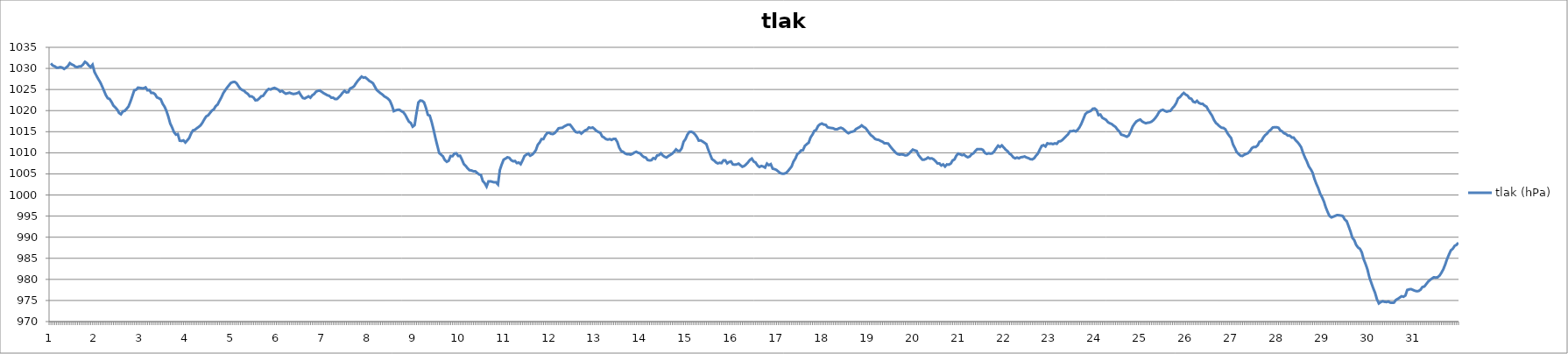
| Category | tlak (hPa) |
|---|---|
| 0 | 1031.19 |
| 1 | 1030.69 |
| 2 | 1030.5 |
| 3 | 1030.19 |
| 4 | 1030.19 |
| 5 | 1030.31 |
| 6 | 1030.19 |
| 7 | 1029.88 |
| 8 | 1030.19 |
| 9 | 1030.56 |
| 10 | 1031.25 |
| 11 | 1030.94 |
| 12 | 1030.75 |
| 13 | 1030.38 |
| 14 | 1030.31 |
| 15 | 1030.5 |
| 16 | 1030.5 |
| 17 | 1030.94 |
| 18 | 1031.56 |
| 19 | 1031.25 |
| 20 | 1030.69 |
| 21 | 1030.31 |
| 22 | 1030.88 |
| 23 | 1029.19 |
| 24 | 1028.31 |
| 25 | 1027.5 |
| 26 | 1026.75 |
| 27 | 1025.81 |
| 28 | 1024.75 |
| 29 | 1023.69 |
| 30 | 1022.94 |
| 31 | 1022.75 |
| 32 | 1022.06 |
| 33 | 1021.19 |
| 34 | 1020.75 |
| 35 | 1020.25 |
| 36 | 1019.44 |
| 37 | 1019.13 |
| 38 | 1019.81 |
| 39 | 1019.94 |
| 40 | 1020.44 |
| 41 | 1021 |
| 42 | 1022.13 |
| 43 | 1023.44 |
| 44 | 1024.81 |
| 45 | 1024.94 |
| 46 | 1025.44 |
| 47 | 1025.38 |
| 48 | 1025.31 |
| 49 | 1025.31 |
| 50 | 1025.5 |
| 51 | 1024.81 |
| 52 | 1024.88 |
| 53 | 1024.19 |
| 54 | 1024.19 |
| 55 | 1023.88 |
| 56 | 1023.13 |
| 57 | 1022.94 |
| 58 | 1022.69 |
| 59 | 1021.63 |
| 60 | 1020.94 |
| 61 | 1019.94 |
| 62 | 1018.56 |
| 63 | 1016.94 |
| 64 | 1016 |
| 65 | 1014.88 |
| 66 | 1014.31 |
| 67 | 1014.44 |
| 68 | 1012.88 |
| 69 | 1012.81 |
| 70 | 1012.94 |
| 71 | 1012.44 |
| 72 | 1012.94 |
| 73 | 1013.5 |
| 74 | 1014.56 |
| 75 | 1015.31 |
| 76 | 1015.44 |
| 77 | 1015.81 |
| 78 | 1016.13 |
| 79 | 1016.5 |
| 80 | 1017.13 |
| 81 | 1017.94 |
| 82 | 1018.63 |
| 83 | 1018.88 |
| 84 | 1019.44 |
| 85 | 1020 |
| 86 | 1020.31 |
| 87 | 1021.06 |
| 88 | 1021.44 |
| 89 | 1022.31 |
| 90 | 1023.13 |
| 91 | 1024.13 |
| 92 | 1024.81 |
| 93 | 1025.44 |
| 94 | 1026 |
| 95 | 1026.56 |
| 96 | 1026.75 |
| 97 | 1026.81 |
| 98 | 1026.5 |
| 99 | 1025.81 |
| 100 | 1025.19 |
| 101 | 1024.88 |
| 102 | 1024.69 |
| 103 | 1024.25 |
| 104 | 1023.94 |
| 105 | 1023.38 |
| 106 | 1023.38 |
| 107 | 1023.06 |
| 108 | 1022.44 |
| 109 | 1022.5 |
| 110 | 1022.88 |
| 111 | 1023.38 |
| 112 | 1023.5 |
| 113 | 1024.13 |
| 114 | 1024.75 |
| 115 | 1025.13 |
| 116 | 1025 |
| 117 | 1025.25 |
| 118 | 1025.38 |
| 119 | 1025.19 |
| 120 | 1024.94 |
| 121 | 1024.5 |
| 122 | 1024.69 |
| 123 | 1024.31 |
| 124 | 1024 |
| 125 | 1024.13 |
| 126 | 1024.25 |
| 127 | 1024.06 |
| 128 | 1023.94 |
| 129 | 1024 |
| 130 | 1024.13 |
| 131 | 1024.38 |
| 132 | 1023.63 |
| 133 | 1023 |
| 134 | 1022.88 |
| 135 | 1023.13 |
| 136 | 1023.38 |
| 137 | 1023.06 |
| 138 | 1023.63 |
| 139 | 1023.94 |
| 140 | 1024.5 |
| 141 | 1024.69 |
| 142 | 1024.75 |
| 143 | 1024.44 |
| 144 | 1024.13 |
| 145 | 1023.88 |
| 146 | 1023.63 |
| 147 | 1023.5 |
| 148 | 1023.06 |
| 149 | 1023.06 |
| 150 | 1022.75 |
| 151 | 1022.75 |
| 152 | 1023.19 |
| 153 | 1023.63 |
| 154 | 1024.25 |
| 155 | 1024.69 |
| 156 | 1024.31 |
| 157 | 1024.38 |
| 158 | 1025.25 |
| 159 | 1025.44 |
| 160 | 1025.75 |
| 161 | 1026.44 |
| 162 | 1027.06 |
| 163 | 1027.56 |
| 164 | 1028.06 |
| 165 | 1027.81 |
| 166 | 1027.88 |
| 167 | 1027.5 |
| 168 | 1027.06 |
| 169 | 1026.81 |
| 170 | 1026.5 |
| 171 | 1025.69 |
| 172 | 1024.88 |
| 173 | 1024.5 |
| 174 | 1024.13 |
| 175 | 1023.81 |
| 176 | 1023.38 |
| 177 | 1023.13 |
| 178 | 1022.81 |
| 179 | 1022.31 |
| 180 | 1021.25 |
| 181 | 1019.88 |
| 182 | 1020.06 |
| 183 | 1020.19 |
| 184 | 1020.19 |
| 185 | 1019.88 |
| 186 | 1019.63 |
| 187 | 1019.06 |
| 188 | 1018.19 |
| 189 | 1017.38 |
| 190 | 1017.06 |
| 191 | 1016.19 |
| 192 | 1016.56 |
| 193 | 1019.44 |
| 194 | 1021.94 |
| 195 | 1022.38 |
| 196 | 1022.31 |
| 197 | 1021.94 |
| 198 | 1020.63 |
| 199 | 1019 |
| 200 | 1018.81 |
| 201 | 1017.31 |
| 202 | 1015.5 |
| 203 | 1013.5 |
| 204 | 1011.69 |
| 205 | 1009.94 |
| 206 | 1009.56 |
| 207 | 1009.13 |
| 208 | 1008.25 |
| 209 | 1007.88 |
| 210 | 1008.13 |
| 211 | 1009.25 |
| 212 | 1009.19 |
| 213 | 1009.81 |
| 214 | 1009.88 |
| 215 | 1009.25 |
| 216 | 1009.31 |
| 217 | 1008.38 |
| 218 | 1007.31 |
| 219 | 1006.88 |
| 220 | 1006.31 |
| 221 | 1005.88 |
| 222 | 1005.81 |
| 223 | 1005.63 |
| 224 | 1005.63 |
| 225 | 1005.25 |
| 226 | 1004.88 |
| 227 | 1004.75 |
| 228 | 1003.31 |
| 229 | 1002.81 |
| 230 | 1002 |
| 231 | 1003.25 |
| 232 | 1003.25 |
| 233 | 1003.13 |
| 234 | 1003 |
| 235 | 1003 |
| 236 | 1002.5 |
| 237 | 1005.94 |
| 238 | 1007.25 |
| 239 | 1008.38 |
| 240 | 1008.63 |
| 241 | 1008.94 |
| 242 | 1008.81 |
| 243 | 1008.25 |
| 244 | 1008 |
| 245 | 1008.06 |
| 246 | 1007.56 |
| 247 | 1007.69 |
| 248 | 1007.31 |
| 249 | 1008.19 |
| 250 | 1009.25 |
| 251 | 1009.56 |
| 252 | 1009.81 |
| 253 | 1009.31 |
| 254 | 1009.56 |
| 255 | 1010 |
| 256 | 1010.63 |
| 257 | 1011.88 |
| 258 | 1012.44 |
| 259 | 1013.25 |
| 260 | 1013.25 |
| 261 | 1014.13 |
| 262 | 1014.69 |
| 263 | 1014.75 |
| 264 | 1014.5 |
| 265 | 1014.44 |
| 266 | 1014.69 |
| 267 | 1015.19 |
| 268 | 1015.81 |
| 269 | 1015.88 |
| 270 | 1015.94 |
| 271 | 1016.25 |
| 272 | 1016.5 |
| 273 | 1016.69 |
| 274 | 1016.69 |
| 275 | 1016.13 |
| 276 | 1015.5 |
| 277 | 1014.94 |
| 278 | 1014.81 |
| 279 | 1014.94 |
| 280 | 1014.56 |
| 281 | 1014.94 |
| 282 | 1015.31 |
| 283 | 1015.5 |
| 284 | 1016 |
| 285 | 1015.88 |
| 286 | 1016 |
| 287 | 1015.63 |
| 288 | 1015.19 |
| 289 | 1014.94 |
| 290 | 1014.75 |
| 291 | 1013.88 |
| 292 | 1013.63 |
| 293 | 1013.25 |
| 294 | 1013.13 |
| 295 | 1013.25 |
| 296 | 1013.06 |
| 297 | 1013.31 |
| 298 | 1013.31 |
| 299 | 1012.56 |
| 300 | 1011.25 |
| 301 | 1010.44 |
| 302 | 1010.25 |
| 303 | 1009.88 |
| 304 | 1009.69 |
| 305 | 1009.69 |
| 306 | 1009.56 |
| 307 | 1009.75 |
| 308 | 1010.06 |
| 309 | 1010.25 |
| 310 | 1010 |
| 311 | 1009.88 |
| 312 | 1009.38 |
| 313 | 1009 |
| 314 | 1008.88 |
| 315 | 1008.31 |
| 316 | 1008.19 |
| 317 | 1008.25 |
| 318 | 1008.75 |
| 319 | 1008.56 |
| 320 | 1009.38 |
| 321 | 1009.44 |
| 322 | 1009.88 |
| 323 | 1009.38 |
| 324 | 1009.06 |
| 325 | 1008.88 |
| 326 | 1009.25 |
| 327 | 1009.5 |
| 328 | 1009.81 |
| 329 | 1010.25 |
| 330 | 1010.81 |
| 331 | 1010.44 |
| 332 | 1010.44 |
| 333 | 1011.06 |
| 334 | 1012.63 |
| 335 | 1013.25 |
| 336 | 1014.31 |
| 337 | 1014.94 |
| 338 | 1015 |
| 339 | 1014.81 |
| 340 | 1014.38 |
| 341 | 1013.75 |
| 342 | 1012.88 |
| 343 | 1012.94 |
| 344 | 1012.69 |
| 345 | 1012.38 |
| 346 | 1012.06 |
| 347 | 1010.75 |
| 348 | 1009.63 |
| 349 | 1008.5 |
| 350 | 1008.19 |
| 351 | 1007.75 |
| 352 | 1007.5 |
| 353 | 1007.63 |
| 354 | 1007.56 |
| 355 | 1008.19 |
| 356 | 1008.19 |
| 357 | 1007.5 |
| 358 | 1007.81 |
| 359 | 1007.94 |
| 360 | 1007.25 |
| 361 | 1007.19 |
| 362 | 1007.25 |
| 363 | 1007.44 |
| 364 | 1007.06 |
| 365 | 1006.69 |
| 366 | 1006.88 |
| 367 | 1007.25 |
| 368 | 1007.75 |
| 369 | 1008.31 |
| 370 | 1008.63 |
| 371 | 1007.94 |
| 372 | 1007.69 |
| 373 | 1007 |
| 374 | 1006.63 |
| 375 | 1006.88 |
| 376 | 1006.75 |
| 377 | 1006.5 |
| 378 | 1007.44 |
| 379 | 1007.06 |
| 380 | 1007.31 |
| 381 | 1006.25 |
| 382 | 1006.13 |
| 383 | 1005.94 |
| 384 | 1005.56 |
| 385 | 1005.19 |
| 386 | 1005.06 |
| 387 | 1005.06 |
| 388 | 1005.19 |
| 389 | 1005.63 |
| 390 | 1006.19 |
| 391 | 1006.75 |
| 392 | 1007.94 |
| 393 | 1008.63 |
| 394 | 1009.69 |
| 395 | 1010 |
| 396 | 1010.56 |
| 397 | 1010.63 |
| 398 | 1011.63 |
| 399 | 1012.06 |
| 400 | 1012.38 |
| 401 | 1013.63 |
| 402 | 1014.31 |
| 403 | 1015.19 |
| 404 | 1015.44 |
| 405 | 1016.38 |
| 406 | 1016.75 |
| 407 | 1016.94 |
| 408 | 1016.69 |
| 409 | 1016.63 |
| 410 | 1016.06 |
| 411 | 1015.94 |
| 412 | 1015.88 |
| 413 | 1015.81 |
| 414 | 1015.56 |
| 415 | 1015.56 |
| 416 | 1015.81 |
| 417 | 1015.94 |
| 418 | 1015.75 |
| 419 | 1015.38 |
| 420 | 1014.94 |
| 421 | 1014.63 |
| 422 | 1014.88 |
| 423 | 1015 |
| 424 | 1015.13 |
| 425 | 1015.63 |
| 426 | 1015.88 |
| 427 | 1016.13 |
| 428 | 1016.5 |
| 429 | 1016.13 |
| 430 | 1015.88 |
| 431 | 1015.31 |
| 432 | 1014.63 |
| 433 | 1014.13 |
| 434 | 1013.81 |
| 435 | 1013.31 |
| 436 | 1013.13 |
| 437 | 1013.06 |
| 438 | 1012.81 |
| 439 | 1012.63 |
| 440 | 1012.25 |
| 441 | 1012.25 |
| 442 | 1012.19 |
| 443 | 1011.56 |
| 444 | 1011 |
| 445 | 1010.5 |
| 446 | 1010 |
| 447 | 1009.69 |
| 448 | 1009.56 |
| 449 | 1009.63 |
| 450 | 1009.56 |
| 451 | 1009.38 |
| 452 | 1009.44 |
| 453 | 1009.81 |
| 454 | 1010.31 |
| 455 | 1010.75 |
| 456 | 1010.56 |
| 457 | 1010.44 |
| 458 | 1009.44 |
| 459 | 1008.88 |
| 460 | 1008.38 |
| 461 | 1008.38 |
| 462 | 1008.56 |
| 463 | 1008.88 |
| 464 | 1008.63 |
| 465 | 1008.69 |
| 466 | 1008.44 |
| 467 | 1008 |
| 468 | 1007.5 |
| 469 | 1007.5 |
| 470 | 1007 |
| 471 | 1007.25 |
| 472 | 1006.75 |
| 473 | 1007.25 |
| 474 | 1007.19 |
| 475 | 1007.44 |
| 476 | 1008.19 |
| 477 | 1008.44 |
| 478 | 1009.38 |
| 479 | 1009.81 |
| 480 | 1009.63 |
| 481 | 1009.44 |
| 482 | 1009.56 |
| 483 | 1009.19 |
| 484 | 1008.94 |
| 485 | 1009.13 |
| 486 | 1009.63 |
| 487 | 1009.88 |
| 488 | 1010.44 |
| 489 | 1010.88 |
| 490 | 1010.88 |
| 491 | 1010.88 |
| 492 | 1010.69 |
| 493 | 1010 |
| 494 | 1009.75 |
| 495 | 1009.88 |
| 496 | 1009.81 |
| 497 | 1009.88 |
| 498 | 1010.38 |
| 499 | 1011.06 |
| 500 | 1011.69 |
| 501 | 1011.38 |
| 502 | 1011.75 |
| 503 | 1011.25 |
| 504 | 1010.75 |
| 505 | 1010.38 |
| 506 | 1009.81 |
| 507 | 1009.5 |
| 508 | 1008.94 |
| 509 | 1008.69 |
| 510 | 1008.88 |
| 511 | 1008.69 |
| 512 | 1008.94 |
| 513 | 1009 |
| 514 | 1009.13 |
| 515 | 1008.88 |
| 516 | 1008.75 |
| 517 | 1008.5 |
| 518 | 1008.44 |
| 519 | 1008.69 |
| 520 | 1009.31 |
| 521 | 1009.81 |
| 522 | 1010.75 |
| 523 | 1011.63 |
| 524 | 1011.81 |
| 525 | 1011.5 |
| 526 | 1012.25 |
| 527 | 1012.13 |
| 528 | 1012.19 |
| 529 | 1012.06 |
| 530 | 1012.25 |
| 531 | 1012.13 |
| 532 | 1012.69 |
| 533 | 1012.75 |
| 534 | 1013.06 |
| 535 | 1013.5 |
| 536 | 1014 |
| 537 | 1014.44 |
| 538 | 1015.13 |
| 539 | 1015.13 |
| 540 | 1015.25 |
| 541 | 1015.06 |
| 542 | 1015.44 |
| 543 | 1016.06 |
| 544 | 1016.94 |
| 545 | 1018 |
| 546 | 1019.13 |
| 547 | 1019.56 |
| 548 | 1019.75 |
| 549 | 1019.94 |
| 550 | 1020.44 |
| 551 | 1020.5 |
| 552 | 1020.13 |
| 553 | 1018.94 |
| 554 | 1019.06 |
| 555 | 1018.31 |
| 556 | 1018.06 |
| 557 | 1017.81 |
| 558 | 1017.25 |
| 559 | 1017 |
| 560 | 1016.81 |
| 561 | 1016.44 |
| 562 | 1016.13 |
| 563 | 1015.5 |
| 564 | 1015.06 |
| 565 | 1014.31 |
| 566 | 1014.19 |
| 567 | 1014 |
| 568 | 1013.81 |
| 569 | 1014.13 |
| 570 | 1015.06 |
| 571 | 1016.19 |
| 572 | 1016.88 |
| 573 | 1017.44 |
| 574 | 1017.69 |
| 575 | 1017.88 |
| 576 | 1017.44 |
| 577 | 1017.19 |
| 578 | 1017 |
| 579 | 1017.13 |
| 580 | 1017.19 |
| 581 | 1017.38 |
| 582 | 1017.75 |
| 583 | 1018.25 |
| 584 | 1018.88 |
| 585 | 1019.69 |
| 586 | 1020.06 |
| 587 | 1020.19 |
| 588 | 1019.94 |
| 589 | 1019.75 |
| 590 | 1019.88 |
| 591 | 1019.94 |
| 592 | 1020.56 |
| 593 | 1021.06 |
| 594 | 1021.75 |
| 595 | 1022.88 |
| 596 | 1023.19 |
| 597 | 1023.75 |
| 598 | 1024.19 |
| 599 | 1023.81 |
| 600 | 1023.56 |
| 601 | 1022.94 |
| 602 | 1022.81 |
| 603 | 1022.13 |
| 604 | 1021.94 |
| 605 | 1022.31 |
| 606 | 1021.81 |
| 607 | 1021.63 |
| 608 | 1021.63 |
| 609 | 1021.19 |
| 610 | 1020.94 |
| 611 | 1020.13 |
| 612 | 1019.44 |
| 613 | 1018.75 |
| 614 | 1017.75 |
| 615 | 1017.06 |
| 616 | 1016.69 |
| 617 | 1016.25 |
| 618 | 1015.94 |
| 619 | 1015.88 |
| 620 | 1015.56 |
| 621 | 1014.69 |
| 622 | 1014.06 |
| 623 | 1013.5 |
| 624 | 1012 |
| 625 | 1011.13 |
| 626 | 1010.13 |
| 627 | 1009.69 |
| 628 | 1009.31 |
| 629 | 1009.25 |
| 630 | 1009.56 |
| 631 | 1009.75 |
| 632 | 1009.94 |
| 633 | 1010.44 |
| 634 | 1011.13 |
| 635 | 1011.38 |
| 636 | 1011.38 |
| 637 | 1011.75 |
| 638 | 1012.63 |
| 639 | 1012.81 |
| 640 | 1013.63 |
| 641 | 1014.19 |
| 642 | 1014.56 |
| 643 | 1015.13 |
| 644 | 1015.5 |
| 645 | 1016 |
| 646 | 1016.06 |
| 647 | 1016.06 |
| 648 | 1015.94 |
| 649 | 1015.31 |
| 650 | 1015.06 |
| 651 | 1014.63 |
| 652 | 1014.44 |
| 653 | 1014.06 |
| 654 | 1014.06 |
| 655 | 1013.63 |
| 656 | 1013.63 |
| 657 | 1013 |
| 658 | 1012.56 |
| 659 | 1012 |
| 660 | 1011.31 |
| 661 | 1009.94 |
| 662 | 1008.88 |
| 663 | 1007.94 |
| 664 | 1006.81 |
| 665 | 1006.13 |
| 666 | 1005.31 |
| 667 | 1003.81 |
| 668 | 1002.63 |
| 669 | 1001.63 |
| 670 | 1000.31 |
| 671 | 999.5 |
| 672 | 998.44 |
| 673 | 997.06 |
| 674 | 995.94 |
| 675 | 995 |
| 676 | 994.69 |
| 677 | 994.88 |
| 678 | 995.06 |
| 679 | 995.25 |
| 680 | 995.19 |
| 681 | 995.13 |
| 682 | 995 |
| 683 | 994.19 |
| 684 | 993.81 |
| 685 | 992.63 |
| 686 | 991.38 |
| 687 | 989.88 |
| 688 | 989.31 |
| 689 | 988.19 |
| 690 | 987.56 |
| 691 | 987.25 |
| 692 | 986.38 |
| 693 | 984.75 |
| 694 | 983.63 |
| 695 | 982.31 |
| 696 | 980.5 |
| 697 | 979.19 |
| 698 | 977.94 |
| 699 | 976.81 |
| 700 | 975.25 |
| 701 | 974.31 |
| 702 | 974.63 |
| 703 | 974.81 |
| 704 | 974.69 |
| 705 | 974.63 |
| 706 | 974.75 |
| 707 | 974.5 |
| 708 | 974.44 |
| 709 | 974.5 |
| 710 | 975.13 |
| 711 | 975.38 |
| 712 | 975.69 |
| 713 | 976 |
| 714 | 975.88 |
| 715 | 976.19 |
| 716 | 977.5 |
| 717 | 977.63 |
| 718 | 977.69 |
| 719 | 977.5 |
| 720 | 977.31 |
| 721 | 977.19 |
| 722 | 977.25 |
| 723 | 977.56 |
| 724 | 978.19 |
| 725 | 978.31 |
| 726 | 978.88 |
| 727 | 979.44 |
| 728 | 979.88 |
| 729 | 980.19 |
| 730 | 980.5 |
| 731 | 980.44 |
| 732 | 980.5 |
| 733 | 980.88 |
| 734 | 981.56 |
| 735 | 982.38 |
| 736 | 983.5 |
| 737 | 984.81 |
| 738 | 985.88 |
| 739 | 986.88 |
| 740 | 987.25 |
| 741 | 987.94 |
| 742 | 988.19 |
| 743 | 988.69 |